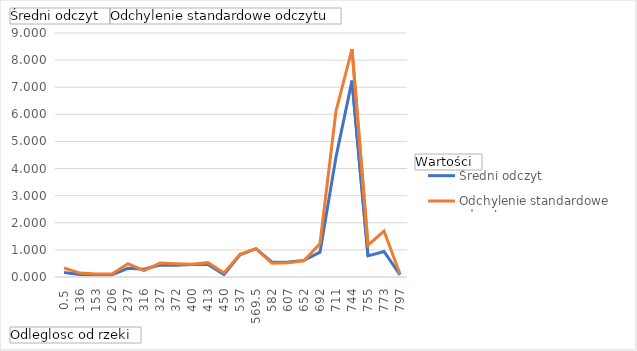
| Category | Średni odczyt | Odchylenie standardowe odczytu |
|---|---|---|
| 0.5 | 0.167 | 0.33 |
| 136 | 0.094 | 0.145 |
| 153 | 0.084 | 0.114 |
| 206 | 0.086 | 0.107 |
| 237 | 0.321 | 0.488 |
| 316 | 0.284 | 0.238 |
| 327 | 0.438 | 0.513 |
| 372 | 0.434 | 0.488 |
| 400 | 0.459 | 0.474 |
| 413 | 0.46 | 0.529 |
| 450 | 0.095 | 0.151 |
| 537 | 0.815 | 0.834 |
| 569.5 | 1.045 | 1.044 |
| 582 | 0.546 | 0.507 |
| 607 | 0.553 | 0.529 |
| 652 | 0.613 | 0.597 |
| 692 | 0.916 | 1.236 |
| 711 | 4.429 | 6.124 |
| 744 | 7.245 | 8.409 |
| 755 | 0.779 | 1.173 |
| 773 | 0.94 | 1.696 |
| 797 | 0.078 | 0.108 |